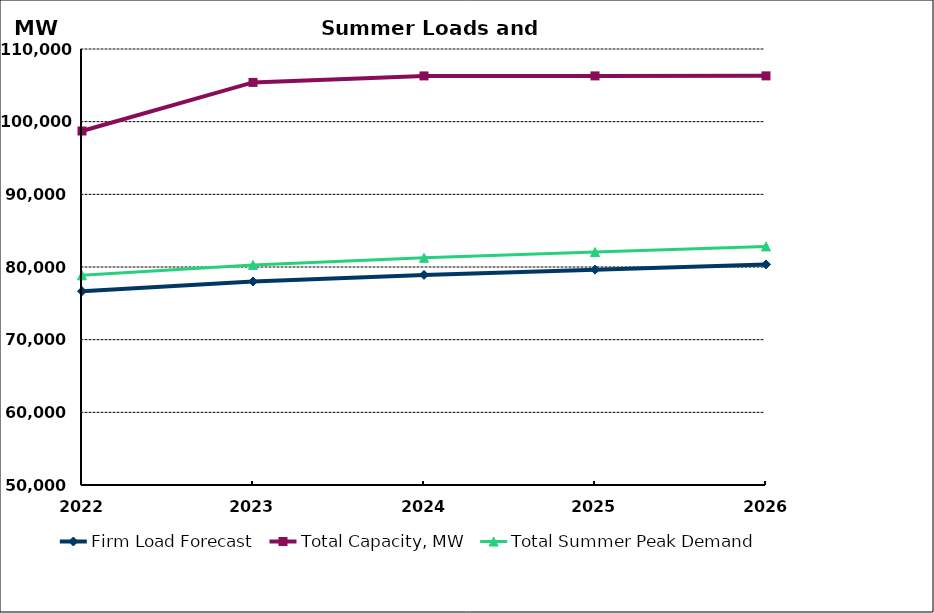
| Category | Firm Load Forecast | Total Capacity, MW | Total Summer Peak Demand |
|---|---|---|---|
| 2022.0 | 76668.724 | 98716.861 | 78855.251 |
| 2023.0 | 78003.765 | 105398.964 | 80280.292 |
| 2024.0 | 78910.915 | 106295.884 | 81266.818 |
| 2025.0 | 79635.145 | 106298.884 | 82057.638 |
| 2026.0 | 80357.605 | 106301.884 | 82838.059 |